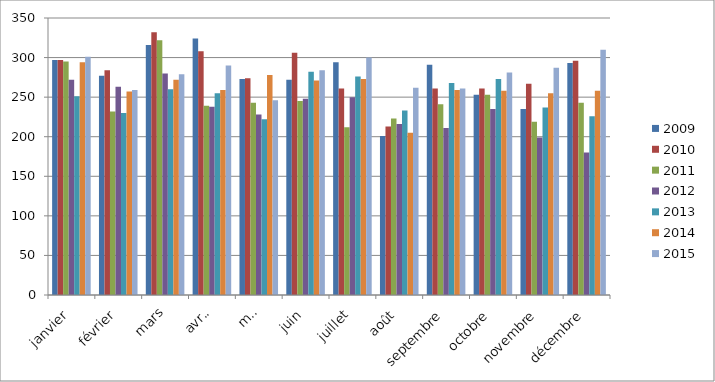
| Category | 2009 | 2010 | 2011 | 2012 | 2013 | 2014 | 2015 |
|---|---|---|---|---|---|---|---|
| janvier | 297 | 297 | 295 | 272 | 251 | 294 | 301 |
| février | 277 | 284 | 232 | 263 | 230 | 257 | 259 |
| mars | 316 | 332 | 322 | 280 | 260 | 272 | 279 |
| avril | 324 | 308 | 239 | 238 | 255 | 259 | 290 |
| mai | 273 | 274 | 243 | 228 | 222 | 278 | 246 |
| juin | 272 | 306 | 245 | 248 | 282 | 271 | 284 |
| juillet | 294 | 261 | 212 | 250 | 276 | 273 | 300 |
| août | 201 | 213 | 223 | 216 | 233 | 205 | 262 |
| septembre | 291 | 261 | 241 | 211 | 268 | 259 | 261 |
| octobre | 253 | 261 | 253 | 235 | 273 | 258 | 281 |
| novembre | 235 | 267 | 219 | 199 | 237 | 255 | 287 |
| décembre | 293 | 296 | 243 | 180 | 226 | 258 | 310 |